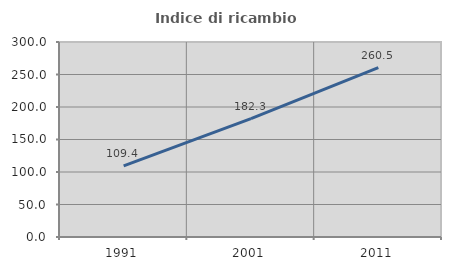
| Category | Indice di ricambio occupazionale  |
|---|---|
| 1991.0 | 109.42 |
| 2001.0 | 182.258 |
| 2011.0 | 260.504 |